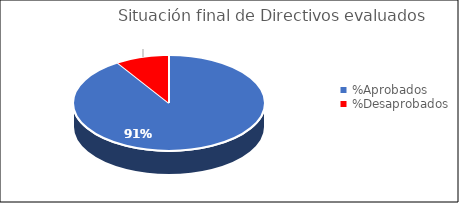
| Category | Series 0 |
|---|---|
| %Aprobados | 0.91 |
| %Desaprobados | 0.09 |